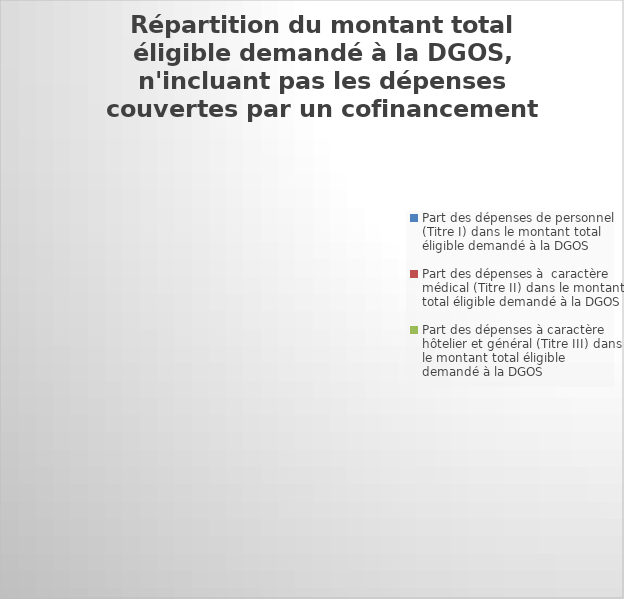
| Category | Series 0 |
|---|---|
| Part des dépenses de personnel (Titre I) dans le montant total éligible demandé à la DGOS | 0 |
| Part des dépenses à  caractère médical (Titre II) dans le montant total éligible demandé à la DGOS | 0 |
| Part des dépenses à caractère hôtelier et général (Titre III) dans le montant total éligible demandé à la DGOS | 0 |